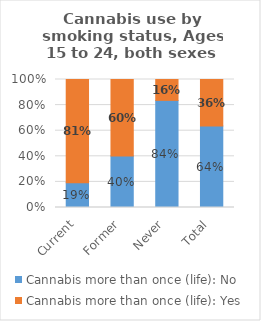
| Category | Cannabis more than once (life): No | Cannabis more than once (life): Yes |
|---|---|---|
| Current | 0.194 | 0.806 |
| Former | 0.403 | 0.597 |
| Never | 0.837 | 0.163 |
| Total | 0.636 | 0.364 |